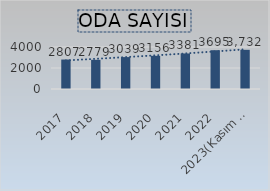
| Category | Series 6 |
|---|---|
| 2017 | 2807 |
| 2018 | 2779 |
| 2019 | 3039 |
| 2020 | 3156 |
| 2021 | 3381 |
| 2022 | 3695 |
| 2023(Kasım Ayı İtibariyle) | 3732 |